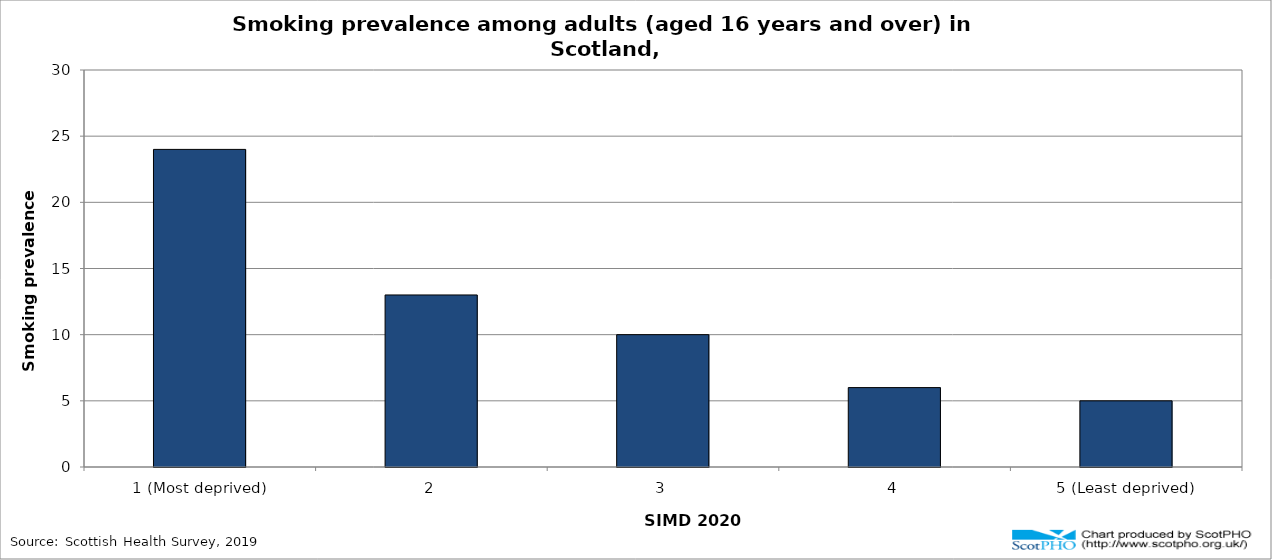
| Category | % |
|---|---|
| 1 (Most deprived) | 24 |
| 2 | 13 |
| 3 | 10 |
| 4 | 6 |
| 5 (Least deprived) | 5 |